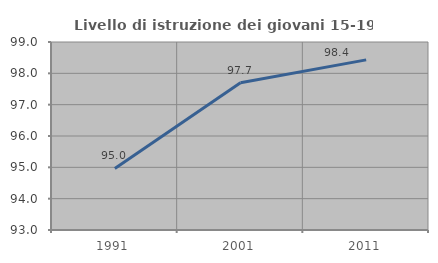
| Category | Livello di istruzione dei giovani 15-19 anni |
|---|---|
| 1991.0 | 94.965 |
| 2001.0 | 97.697 |
| 2011.0 | 98.429 |